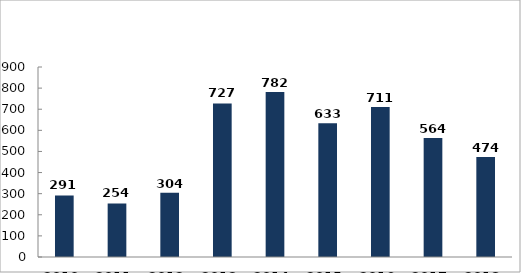
| Category | Végrehajtott elővezetések száma |
|---|---|
| 2010. év | 291 |
| 2011. év | 254 |
| 2012. év | 304 |
| 2013. év | 727 |
| 2014. év | 782 |
| 2015. év | 633 |
| 2016. év | 711 |
| 2017. év | 564 |
| 2018. év | 474 |